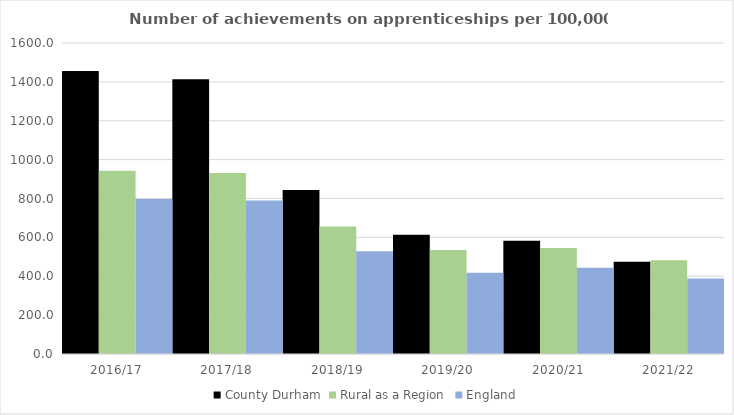
| Category | County Durham | Rural as a Region | England |
|---|---|---|---|
| 2016/17 | 1456 | 942.594 | 797 |
| 2017/18 | 1413 | 931.709 | 790 |
| 2018/19 | 844 | 656.44 | 528 |
| 2019/20 | 614 | 535.552 | 418 |
| 2020/21 | 583 | 545.333 | 444 |
| 2021/22 | 475 | 482.936 | 389 |